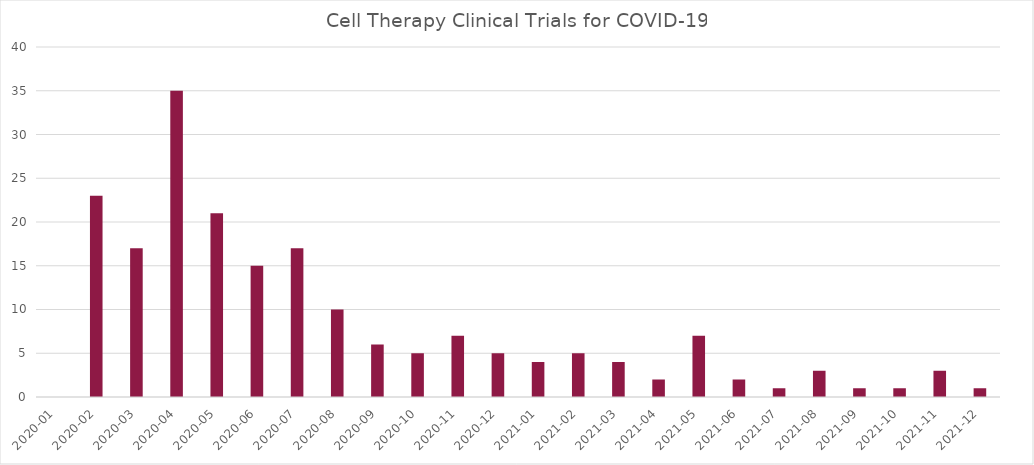
| Category | Series 0 |
|---|---|
| 2020-01 | 0 |
| 2020-02 | 23 |
| 2020-03 | 17 |
| 2020-04 | 35 |
| 2020-05 | 21 |
| 2020-06 | 15 |
| 2020-07 | 17 |
| 2020-08 | 10 |
| 2020-09 | 6 |
| 2020-10 | 5 |
| 2020-11 | 7 |
| 2020-12 | 5 |
| 2021-01 | 4 |
| 2021-02 | 5 |
| 2021-03 | 4 |
| 2021-04 | 2 |
| 2021-05 | 7 |
| 2021-06 | 2 |
| 2021-07 | 1 |
| 2021-08 | 3 |
| 2021-09 | 1 |
| 2021-10 | 1 |
| 2021-11 | 3 |
| 2021-12 | 1 |